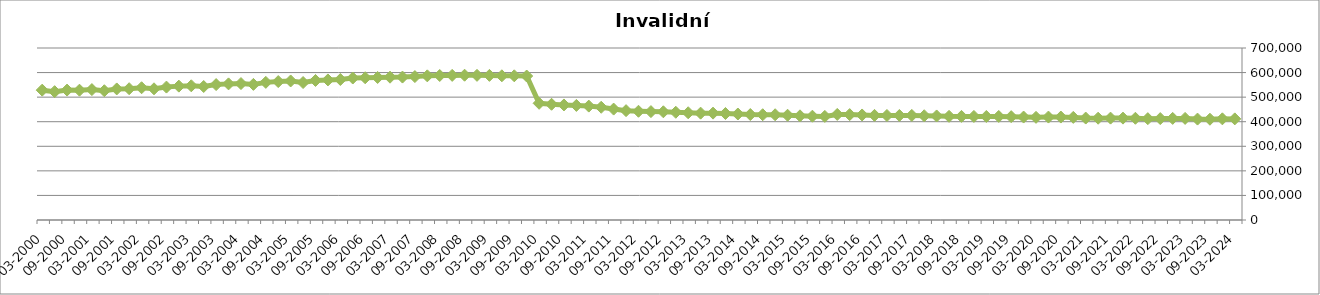
| Category | Invalidní důchodci |
|---|---|
| 03-2024 | 411530 |
| 12-2023 | 411706 |
| 09-2023 | 410149 |
| 06-2023 | 410668 |
| 03-2023 | 413465 |
| 12-2022 | 413513 |
| 09-2022 | 412747 |
| 06-2022 | 412424 |
| 03-2022 | 414028 |
| 12-2021 | 414646 |
| 09-2021 | 414628 |
| 06-2021 | 414275 |
| 03-2021 | 414913 |
| 12-2020 | 417639 |
| 09-2020 | 418942 |
| 06-2020 | 418881 |
| 03-2020 | 417816 |
| 12-2019 | 418983 |
| 09-2019 | 420544 |
| 06-2019 | 421368 |
| 03-2019 | 421317 |
| 12-2018 | 421487 |
| 09-2018 | 421631 |
| 06-2018 | 421896 |
| 03-2018 | 423428 |
| 12-2017 | 424242 |
| 09-2017 | 425611 |
| 06-2017 | 425363 |
| 03-2017 | 425318 |
| 12-2016 | 425788 |
| 09-2016 | 427431 |
| 06-2016 | 428887 |
| 03-2016 | 429630 |
| 12-2015 | 421655 |
| 09-2015 | 422445 |
| 06-2015 | 423981 |
| 03-2015 | 426338 |
| 12-2014 | 428298 |
| 09-2014 | 428413 |
| 06-2014 | 429217 |
| 03-2014 | 431378 |
| 12-2013 | 433414 |
| 09-2013 | 434902 |
| 06-2013 | 434895 |
| 03-2013 | 436409 |
| 12-2012 | 438509 |
| 09-2012 | 440421 |
| 06-2012 | 441142 |
| 03-2012 | 442543 |
| 12-2011 | 445033 |
| 09-2011 | 451409 |
| 06-2011 | 458844 |
| 03-2011 | 463556 |
| 12-2010 | 466329 |
| 09-2010 | 468267 |
| 06-2010 | 470958 |
| 03-2010 | 474991 |
| 12-2009 | 585944 |
| 09-2009 | 586867 |
| 06-2009 | 586864 |
| 03-2009 | 588540 |
| 12-2008 | 588745 |
| 09-2008 | 589247 |
| 06-2008 | 588585 |
| 03-2008 | 588112 |
| 12-2007 | 586686 |
| 09-2007 | 583756 |
| 06-2007 | 581694 |
| 03-2007 | 581173 |
| 12-2006 | 580055 |
| 09-2006 | 578862 |
| 06-2006 | 577813 |
| 03-2006 | 571789 |
| 12-2005 | 570055 |
| 09-2005 | 567797 |
| 06-2005 | 559501 |
| 03-2005 | 565866 |
| 12-2004 | 563376 |
| 09-2004 | 560131 |
| 06-2004 | 551916 |
| 03-2004 | 555295 |
| 12-2003 | 553985 |
| 09-2003 | 551109 |
| 06-2003 | 543257 |
| 03-2003 | 546198 |
| 12-2002 | 544838 |
| 09-2002 | 540927 |
| 06-2002 | 533907 |
| 03-2002 | 538230 |
| 12-2001 | 534287 |
| 09-2001 | 533388 |
| 06-2001 | 526095 |
| 03-2001 | 530752 |
| 12-2000 | 528288 |
| 09-2000 | 528692 |
| 06-2000 | 522380 |
| 03-2000 | 528445 |